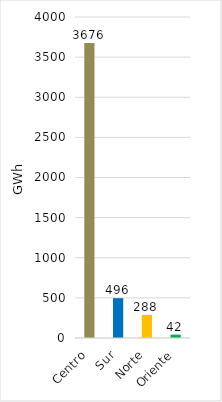
| Category | Series 0 |
|---|---|
| Centro | 3676.383 |
| Sur | 496.418 |
| Norte | 287.509 |
| Oriente | 41.929 |